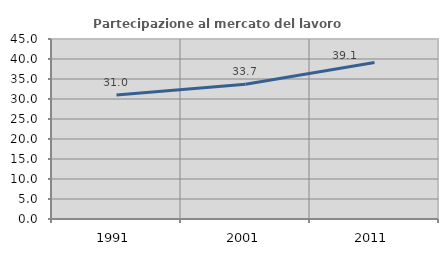
| Category | Partecipazione al mercato del lavoro  femminile |
|---|---|
| 1991.0 | 30.979 |
| 2001.0 | 33.711 |
| 2011.0 | 39.109 |